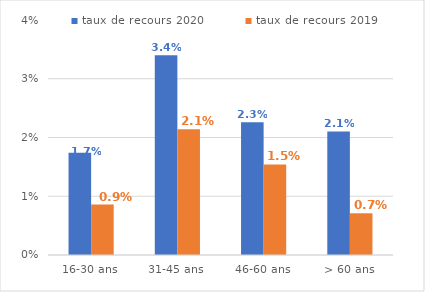
| Category | taux de recours 2020 | taux de recours 2019 |
|---|---|---|
| 16-30 ans | 0.017 | 0.009 |
| 31-45 ans | 0.034 | 0.021 |
| 46-60 ans | 0.023 | 0.015 |
| > 60 ans | 0.021 | 0.007 |